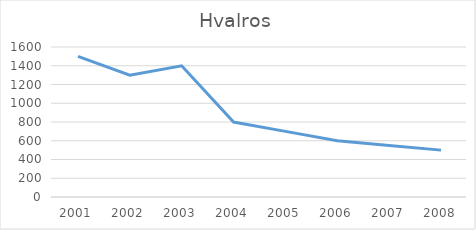
| Category | Series 0 |
|---|---|
| 2001.0 | 1500 |
| 2002.0 | 1300 |
| 2003.0 | 1400 |
| 2004.0 | 800 |
| 2005.0 | 700 |
| 2006.0 | 600 |
| 2007.0 | 550 |
| 2008.0 | 500 |